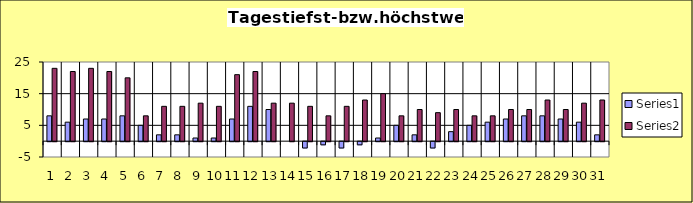
| Category | Series 0 | Series 1 |
|---|---|---|
| 0 | 8 | 23 |
| 1 | 6 | 22 |
| 2 | 7 | 23 |
| 3 | 7 | 22 |
| 4 | 8 | 20 |
| 5 | 5 | 8 |
| 6 | 2 | 11 |
| 7 | 2 | 11 |
| 8 | 1 | 12 |
| 9 | 1 | 11 |
| 10 | 7 | 21 |
| 11 | 11 | 22 |
| 12 | 10 | 12 |
| 13 | 0 | 12 |
| 14 | -2 | 11 |
| 15 | -1 | 8 |
| 16 | -2 | 11 |
| 17 | -1 | 13 |
| 18 | 1 | 15 |
| 19 | 5 | 8 |
| 20 | 2 | 10 |
| 21 | -2 | 9 |
| 22 | 3 | 10 |
| 23 | 5 | 8 |
| 24 | 6 | 8 |
| 25 | 7 | 10 |
| 26 | 8 | 10 |
| 27 | 8 | 13 |
| 28 | 7 | 10 |
| 29 | 6 | 12 |
| 30 | 2 | 13 |